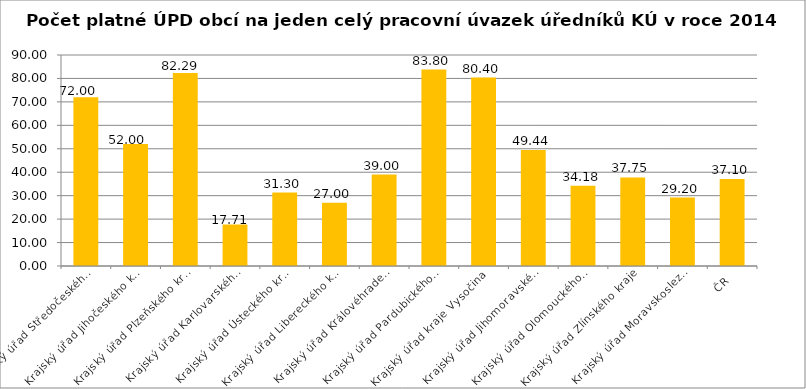
| Category | Počet platné ÚPD obcí na jeden celý pracovní úvazek úředníků KÚ |
|---|---|
| Krajský úřad Středočeského kraje | 72 |
| Krajský úřad Jihočeského kraje | 52 |
| Krajský úřad Plzeňského kraje | 82.29 |
| Krajský úřad Karlovarského kraje | 17.71 |
| Krajský úřad Ústeckého kraje | 31.3 |
| Krajský úřad Libereckého kraje | 27 |
| Krajský úřad Královéhradeckého kraje | 39 |
| Krajský úřad Pardubického kraje | 83.8 |
| Krajský úřad kraje Vysočina | 80.4 |
| Krajský úřad Jihomoravského kraje | 49.44 |
| Krajský úřad Olomouckého kraje | 34.18 |
| Krajský úřad Zlínského kraje | 37.75 |
| Krajský úřad Moravskoslezského kraje | 29.2 |
| ČR | 37.1 |